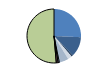
| Category | Series 0 |
|---|---|
| ARRASTRE | 338 |
| CERCO | 158 |
| ATUNEROS CAÑEROS | 13 |
| PALANGRE DE FONDO | 32 |
| PALANGRE DE SUPERFICIE | 67 |
| RASCO | 7 |
| VOLANTA | 10 |
| ARTES FIJAS | 14 |
| ARTES MENORES | 675 |